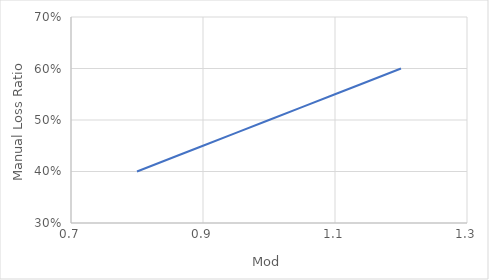
| Category | Manual LR |
|---|---|
| 0.8 | 0.4 |
| 0.9 | 0.45 |
| 1.0 | 0.5 |
| 1.1 | 0.55 |
| 1.2 | 0.6 |